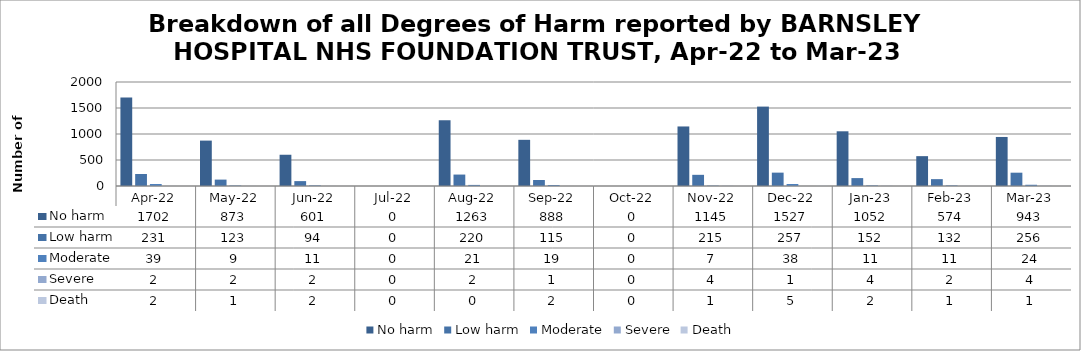
| Category | No harm | Low harm | Moderate | Severe | Death |
|---|---|---|---|---|---|
| Apr-22 | 1702 | 231 | 39 | 2 | 2 |
| May-22 | 873 | 123 | 9 | 2 | 1 |
| Jun-22 | 601 | 94 | 11 | 2 | 2 |
| Jul-22 | 0 | 0 | 0 | 0 | 0 |
| Aug-22 | 1263 | 220 | 21 | 2 | 0 |
| Sep-22 | 888 | 115 | 19 | 1 | 2 |
| Oct-22 | 0 | 0 | 0 | 0 | 0 |
| Nov-22 | 1145 | 215 | 7 | 4 | 1 |
| Dec-22 | 1527 | 257 | 38 | 1 | 5 |
| Jan-23 | 1052 | 152 | 11 | 4 | 2 |
| Feb-23 | 574 | 132 | 11 | 2 | 1 |
| Mar-23 | 943 | 256 | 24 | 4 | 1 |